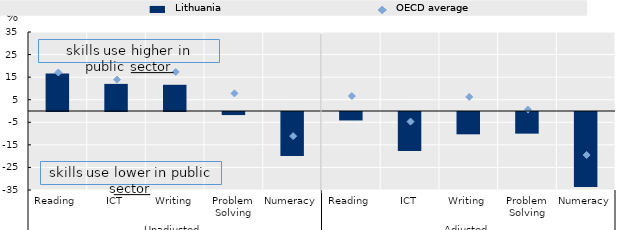
| Category | Lithuania |
|---|---|
| 0 | 16.622 |
| 1 | 12.009 |
| 2 | 11.612 |
| 3 | -1.359 |
| 4 | -19.501 |
| 5 | -3.743 |
| 6 | -17.329 |
| 7 | -9.889 |
| 8 | -9.588 |
| 9 | -33.221 |